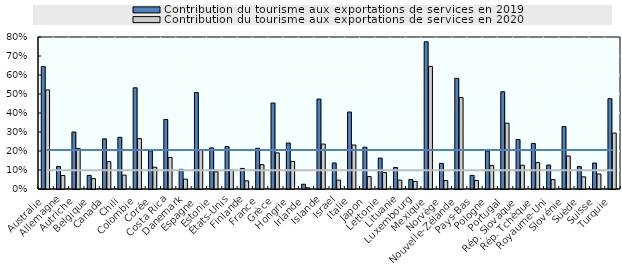
| Category | Contribution du tourisme aux exportations de services en 2019  | Contribution du tourisme aux exportations de services en 2020 |
|---|---|---|
| Australie | 0.644 | 0.521 |
| Allemagne | 0.119 | 0.071 |
| Autriche | 0.3 | 0.214 |
| Belgique | 0.072 | 0.054 |
| Canada | 0.264 | 0.144 |
| Chili | 0.272 | 0.073 |
| Colombie | 0.533 | 0.265 |
| Corée | 0.201 | 0.115 |
| Costa Rica | 0.366 | 0.166 |
| Danemark | 0.103 | 0.052 |
| Espagne | 0.508 | 0.205 |
| Estonie | 0.216 | 0.091 |
| États-Unis | 0.223 | 0.1 |
| Finlande | 0.108 | 0.043 |
| France | 0.214 | 0.128 |
| Grèce | 0.453 | 0.19 |
| Hongrie | 0.242 | 0.145 |
| Irlande | 0.025 | 0.007 |
| Islande | 0.473 | 0.237 |
| Israel | 0.137 | 0.047 |
| Italie | 0.405 | 0.231 |
| Japon | 0.22 | 0.065 |
| Lettonie | 0.163 | 0.086 |
| Lituanie | 0.113 | 0.047 |
| Luxembourg | 0.05 | 0.04 |
| Mexique | 0.775 | 0.645 |
| Norvège | 0.135 | 0.044 |
| Nouvelle-Zélande | 0.583 | 0.481 |
| Pays-Bas | 0.072 | 0.045 |
| Pologne | 0.2 | 0.124 |
| Portugal | 0.512 | 0.346 |
| Rép. Slovaque | 0.261 | 0.125 |
| Rép. Tchèque | 0.24 | 0.139 |
| Royaume-Uni | 0.126 | 0.05 |
| Slovénie | 0.328 | 0.174 |
| Suède | 0.118 | 0.064 |
| Suisse | 0.137 | 0.079 |
| Turquie | 0.475 | 0.294 |